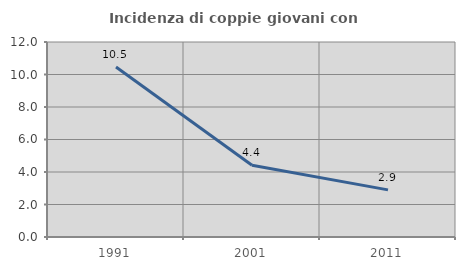
| Category | Incidenza di coppie giovani con figli |
|---|---|
| 1991.0 | 10.465 |
| 2001.0 | 4.412 |
| 2011.0 | 2.899 |